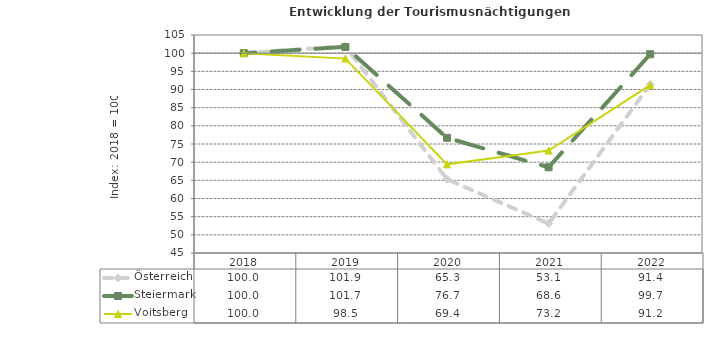
| Category | Österreich | Steiermark | Voitsberg |
|---|---|---|---|
| 2022.0 | 91.4 | 99.7 | 91.2 |
| 2021.0 | 53.1 | 68.6 | 73.2 |
| 2020.0 | 65.3 | 76.7 | 69.4 |
| 2019.0 | 101.9 | 101.7 | 98.5 |
| 2018.0 | 100 | 100 | 100 |